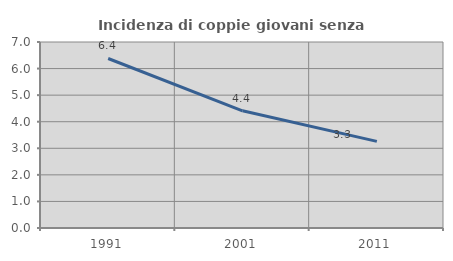
| Category | Incidenza di coppie giovani senza figli |
|---|---|
| 1991.0 | 6.38 |
| 2001.0 | 4.409 |
| 2011.0 | 3.261 |